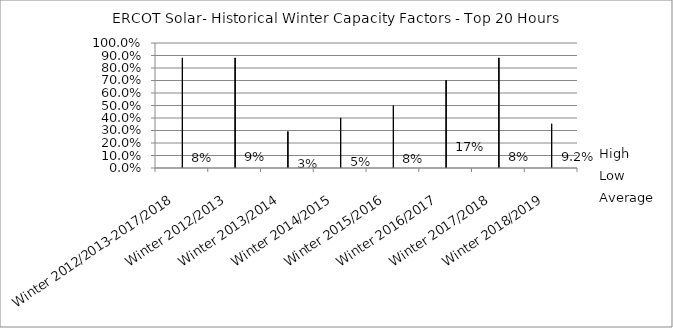
| Category | High | Low | Average |
|---|---|---|---|
| Winter 2012/2013-2017/2018 | 0.881 | 0 | 0.083 |
| Winter 2012/2013 | 0.881 | 0 | 0.089 |
| Winter 2013/2014 | 0.292 | 0 | 0.028 |
| Winter 2014/2015 | 0.401 | 0 | 0.046 |
| Winter 2015/2016 | 0.499 | 0 | 0.076 |
| Winter 2016/2017 | 0.702 | 0 | 0.171 |
| Winter 2017/2018 | 0.881 | 0 | 0.085 |
| Winter 2018/2019 | 0.353 | 0 | 0.092 |